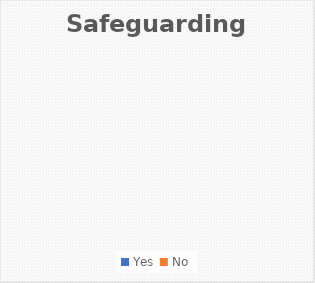
| Category | Series 0 |
|---|---|
| Yes  | 0 |
| No | 0 |